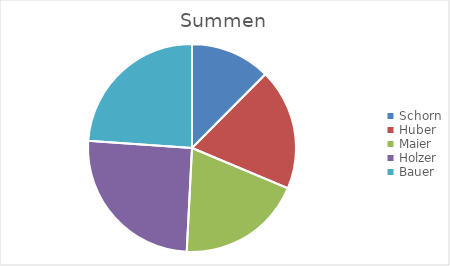
| Category | Summen |
|---|---|
| Schorn | 98272 |
| Huber | 148817.12 |
| Maier | 153738.34 |
| Holzer | 199656.4 |
| Bauer | 188398.67 |